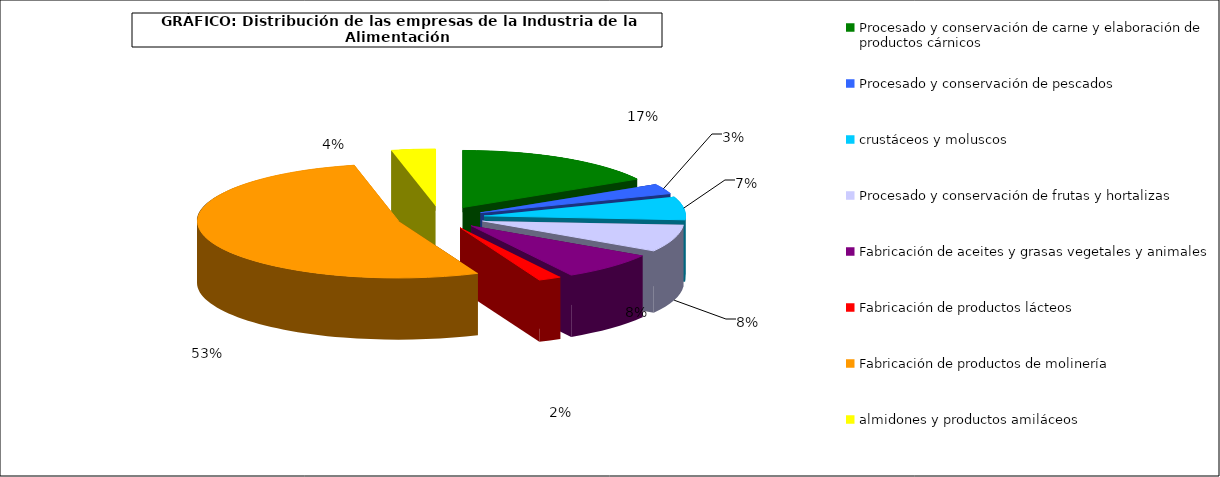
| Category | Procesado y conservación de carne y elaboración de productos cárnicos |
|---|---|
| 0 | 3705 |
| 1 | 639 |
| 2 | 1452 |
| 3 | 1708 |
| 4 | 1756 |
| 5 | 409 |
| 6 | 11745 |
| 7 | 782 |